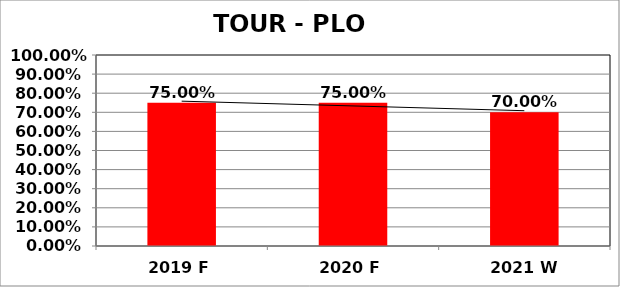
| Category | Series 0 |
|---|---|
| 2019 F | 0.75 |
| 2020 F | 0.75 |
| 2021 W | 0.7 |